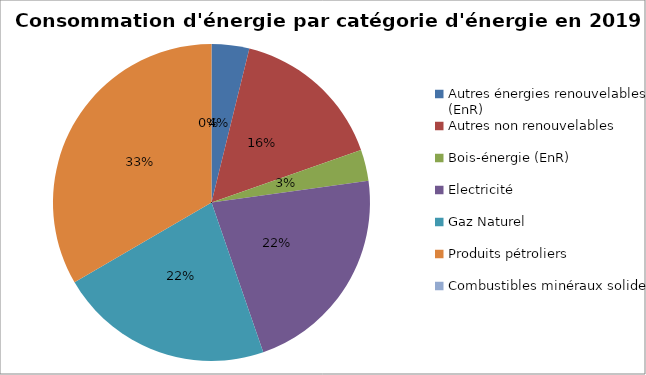
| Category | Series 0 |
|---|---|
| Autres énergies renouvelables (EnR) | 66939.2 |
| Autres non renouvelables | 274820 |
| Bois-énergie (EnR) | 55488.58 |
| Electricité | 381479.98 |
| Gaz Naturel | 381640.78 |
| Produits pétroliers | 581551.65 |
| Combustibles minéraux solides  | 0 |